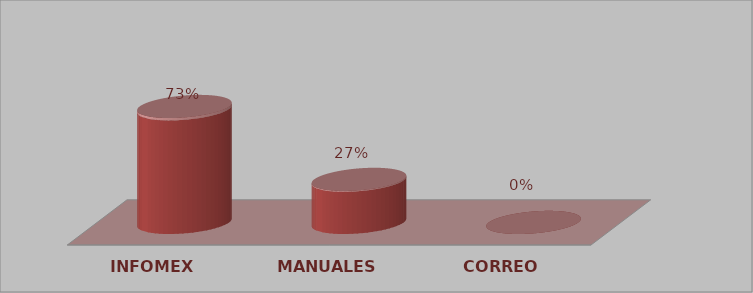
| Category | Series 0 | Series 1 |
|---|---|---|
| INFOMEX | 35 | 0.729 |
| MANUALES | 13 | 0.271 |
| CORREO | 0 | 0 |